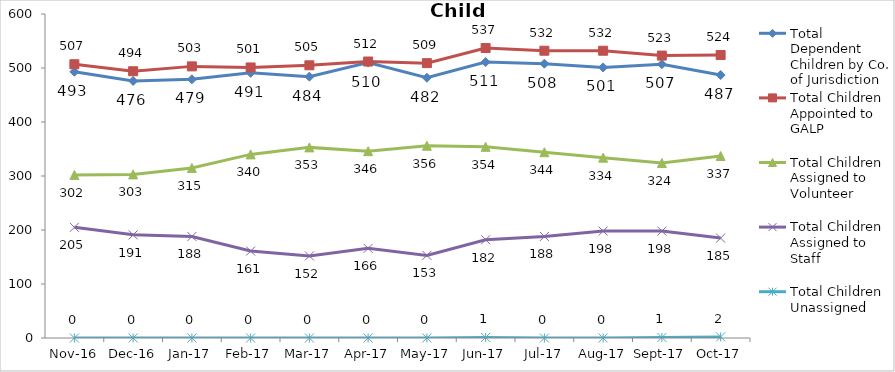
| Category | Total Dependent Children by Co. of Jurisdiction | Total Children Appointed to GALP | Total Children Assigned to Volunteer | Total Children Assigned to Staff | Total Children Unassigned |
|---|---|---|---|---|---|
| 2016-11-01 | 493 | 507 | 302 | 205 | 0 |
| 2016-12-01 | 476 | 494 | 303 | 191 | 0 |
| 2017-01-01 | 479 | 503 | 315 | 188 | 0 |
| 2017-02-01 | 491 | 501 | 340 | 161 | 0 |
| 2017-03-01 | 484 | 505 | 353 | 152 | 0 |
| 2017-04-01 | 510 | 512 | 346 | 166 | 0 |
| 2017-05-01 | 482 | 509 | 356 | 153 | 0 |
| 2017-06-01 | 511 | 537 | 354 | 182 | 1 |
| 2017-07-01 | 508 | 532 | 344 | 188 | 0 |
| 2017-08-01 | 501 | 532 | 334 | 198 | 0 |
| 2017-09-01 | 507 | 523 | 324 | 198 | 1 |
| 2017-10-01 | 487 | 524 | 337 | 185 | 2 |